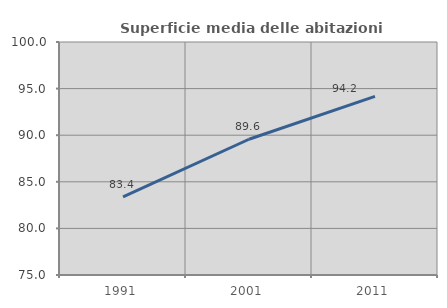
| Category | Superficie media delle abitazioni occupate |
|---|---|
| 1991.0 | 83.382 |
| 2001.0 | 89.565 |
| 2011.0 | 94.173 |